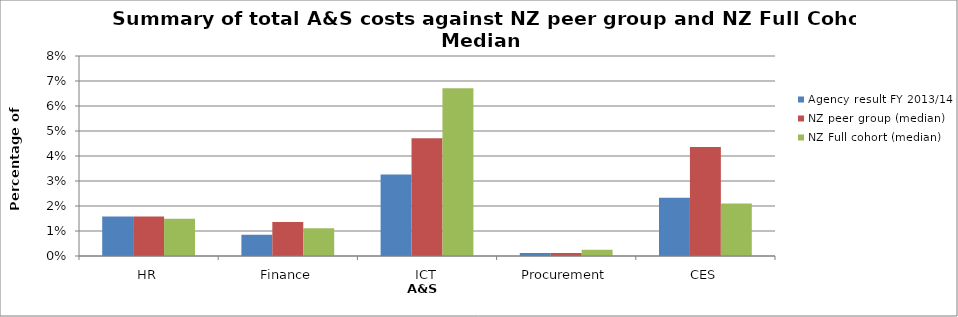
| Category | Agency result FY 2013/14 | NZ peer group (median) | NZ Full cohort (median) |
|---|---|---|---|
| HR | 0.016 | 0.016 | 0.015 |
| Finance | 0.008 | 0.014 | 0.011 |
| ICT | 0.033 | 0.047 | 0.067 |
| Procurement | 0.001 | 0.001 | 0.002 |
| CES | 0.023 | 0.044 | 0.021 |